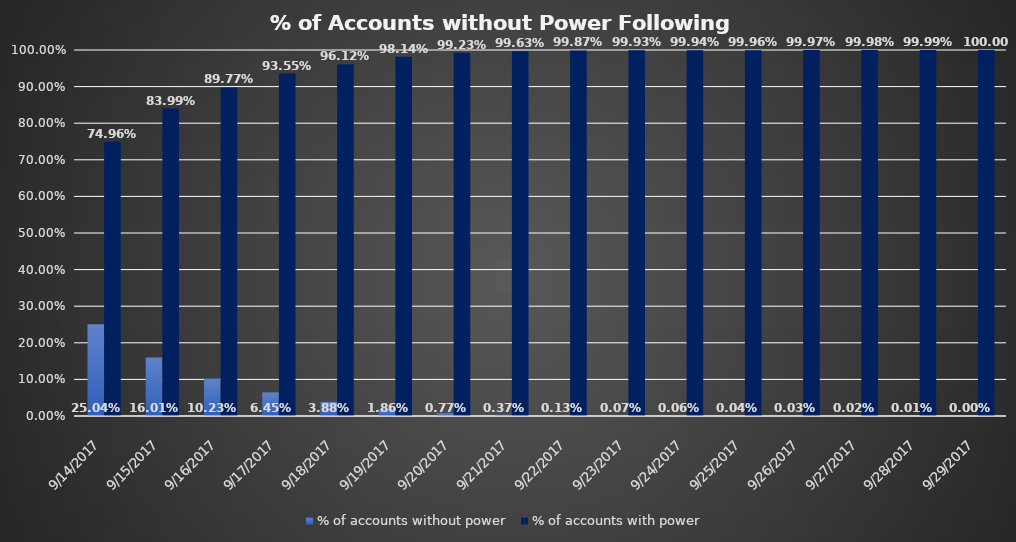
| Category | % of accounts without power | % of accounts with power |
|---|---|---|
| 9/14/17 | 0.25 | 0.75 |
| 9/15/17 | 0.16 | 0.84 |
| 9/16/17 | 0.102 | 0.898 |
| 9/17/17 | 0.065 | 0.935 |
| 9/18/17 | 0.039 | 0.961 |
| 9/19/17 | 0.019 | 0.981 |
| 9/20/17 | 0.008 | 0.992 |
| 9/21/17 | 0.004 | 0.996 |
| 9/22/17 | 0.001 | 0.999 |
| 9/23/17 | 0.001 | 0.999 |
| 9/24/17 | 0.001 | 0.999 |
| 9/25/17 | 0 | 1 |
| 9/26/17 | 0 | 1 |
| 9/27/17 | 0 | 1 |
| 9/28/17 | 0 | 1 |
| 9/29/17 | 0 | 1 |